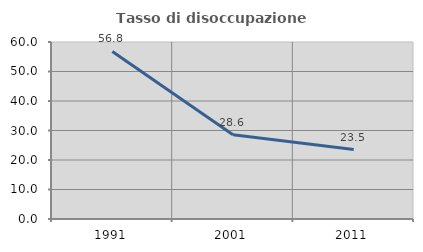
| Category | Tasso di disoccupazione giovanile  |
|---|---|
| 1991.0 | 56.79 |
| 2001.0 | 28.571 |
| 2011.0 | 23.529 |